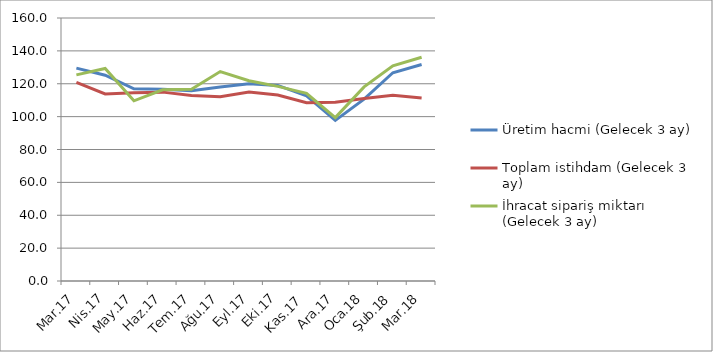
| Category | Üretim hacmi (Gelecek 3 ay) | Toplam istihdam (Gelecek 3 ay) | İhracat sipariş miktarı (Gelecek 3 ay) |
|---|---|---|---|
| Mar.17 | 129.5 | 120.9 | 125.4 |
| Nis.17 | 125.2 | 113.8 | 129.3 |
| May.17 | 116.9 | 114.5 | 109.6 |
| Haz.17 | 116.6 | 114.9 | 116.3 |
| Tem.17 | 115.8 | 112.9 | 116.7 |
| Ağu.17 | 118 | 112.1 | 127.4 |
| Eyl.17 | 120 | 115 | 121.8 |
| Eki.17 | 119 | 113.1 | 118.4 |
| Kas.17 | 112.6 | 108.4 | 114.2 |
| Ara.17 | 97.7 | 108.7 | 99.4 |
| Oca.18 | 110.6 | 111 | 118.1 |
| Şub.18 | 126.7 | 113 | 130.9 |
| Mar.18 | 131.7 | 111.4 | 136.1 |